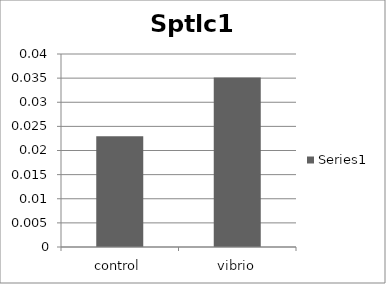
| Category | Series 0 |
|---|---|
| control | 0.023 |
| vibrio | 0.035 |